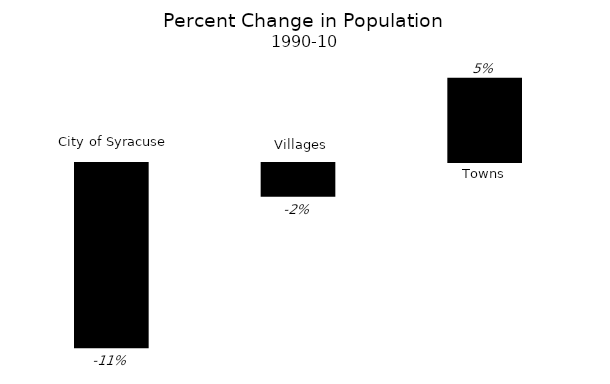
| Category | Series 0 |
|---|---|
| City of Syracuse | -0.11 |
| Villages | -0.02 |
| Towns | 0.05 |